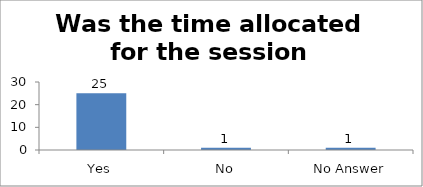
| Category | Was the time allocated for the session sufficient? |
|---|---|
| Yes | 25 |
| No | 1 |
| No Answer | 1 |